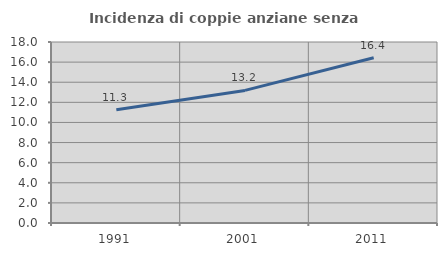
| Category | Incidenza di coppie anziane senza figli  |
|---|---|
| 1991.0 | 11.259 |
| 2001.0 | 13.186 |
| 2011.0 | 16.428 |